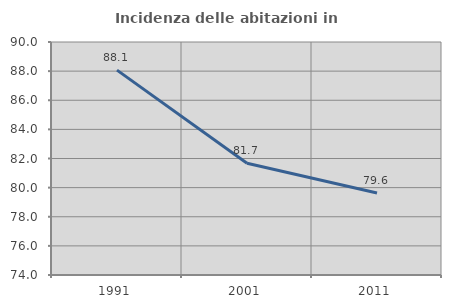
| Category | Incidenza delle abitazioni in proprietà  |
|---|---|
| 1991.0 | 88.07 |
| 2001.0 | 81.672 |
| 2011.0 | 79.628 |